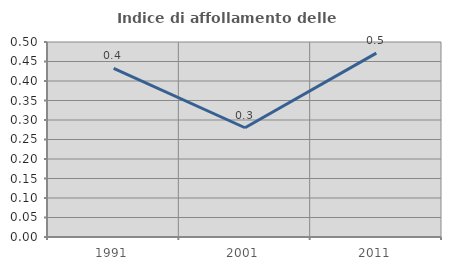
| Category | Indice di affollamento delle abitazioni  |
|---|---|
| 1991.0 | 0.432 |
| 2001.0 | 0.28 |
| 2011.0 | 0.472 |